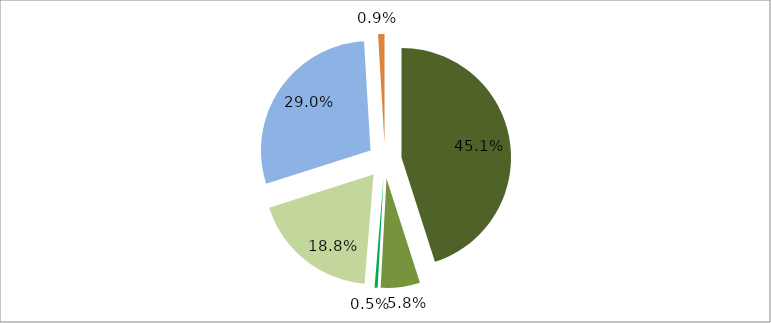
| Category | Series 0 |
|---|---|
| 0 | 0.451 |
| 1 | 0.058 |
| 2 | 0.005 |
| 3 | 0.188 |
| 4 | 0.29 |
| 5 | 0.009 |